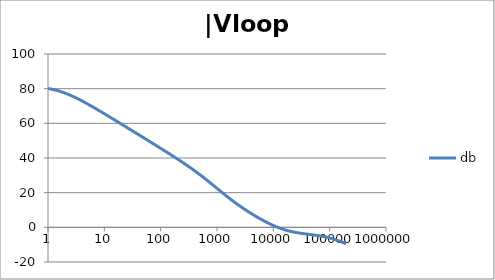
| Category | db |
|---|---|
| 1.0 | 80.109 |
| 1.0634378492473788 | 79.953 |
| 1.1309000592118907 | 79.783 |
| 1.2026419266820265 | 79.598 |
| 1.278934943925458 | 79.399 |
| 1.3600678260954062 | 79.183 |
| 1.4463476038134566 | 78.952 |
| 1.5381007850634825 | 78.705 |
| 1.6356745907936145 | 78.441 |
| 1.739438268902148 | 78.161 |
| 1.849784491579884 | 77.864 |
| 1.967130841296868 | 77.551 |
| 2.091921391056928 | 77.223 |
| 2.2246283849001642 | 76.879 |
| 2.365754025012901 | 76.521 |
| 2.5158323722080485 | 76.148 |
| 2.6754313669678584 | 75.762 |
| 2.8451549786972743 | 75.363 |
| 3.025645491321301 | 74.952 |
| 3.2175859338757533 | 74.529 |
| 3.42170266528945 | 74.096 |
| 3.6387681231394358 | 73.654 |
| 3.8696037467813236 | 73.202 |
| 4.115083085916729 | 72.742 |
| 4.376135106361553 | 72.275 |
| 4.653747705525078 | 71.801 |
| 4.948971450903514 | 71.32 |
| 5.262923555735513 | 70.834 |
| 5.596792106864742 | 70.343 |
| 5.951840560808945 | 69.847 |
| 6.329412525049976 | 69.347 |
| 6.730936842638569 | 68.843 |
| 7.157932999355504 | 68.336 |
| 7.612016873891456 | 67.826 |
| 8.094906852805886 | 67.313 |
| 8.608430333405762 | 66.798 |
| 9.154530639152917 | 66.281 |
| 9.735274373770007 | 65.761 |
| 10.352859241875105 | 65.24 |
| 11.009622365740512 | 64.718 |
| 11.708049129648925 | 64.194 |
| 12.4507825853165 | 63.669 |
| 13.240633453975693 | 63.143 |
| 14.080590762968805 | 62.616 |
| 14.973833157104059 | 62.088 |
| 15.923740927579823 | 61.559 |
| 16.93390880399795 | 61.03 |
| 18.008159557874837 | 60.5 |
| 19.150558469130036 | 59.969 |
| 20.365428710297824 | 59.438 |
| 21.65736770667993 | 58.906 |
| 23.031264534351347 | 58.374 |
| 24.492318421858034 | 57.842 |
| 26.046058425622668 | 57.31 |
| 27.698364353515743 | 56.777 |
| 29.45548901577305 | 56.243 |
| 31.32408188746347 | 55.71 |
| 33.311214272052936 | 55.176 |
| 35.42440606129053 | 54.642 |
| 37.67165419268462 | 54.107 |
| 40.06146291225952 | 53.573 |
| 42.60287595711691 | 53.038 |
| 45.30551077958928 | 52.503 |
| 48.17959494250036 | 51.967 |
| 51.23600482326248 | 51.431 |
| 54.486306773278585 | 50.895 |
| 57.94280088840825 | 50.359 |
| 61.61856755613799 | 49.822 |
| 65.52751695560372 | 49.284 |
| 69.68444169778837 | 48.746 |
| 74.10507280510043 | 48.208 |
| 78.80613924217637 | 47.669 |
| 83.8054312231895 | 47.129 |
| 89.12186753523771 | 46.589 |
| 94.77556713258299 | 46.047 |
| 100.78792527267464 | 45.505 |
| 107.18169448207877 | 44.962 |
| 113.98107065871142 | 44.417 |
| 121.21178463621371 | 43.871 |
| 128.90119955697148 | 43.324 |
| 137.07841442227294 | 42.775 |
| 145.77437421146283 | 42.224 |
| 155.02198698682062 | 41.671 |
| 164.85624842731968 | 41.116 |
| 175.3143742625403 | 40.558 |
| 186.43594110790573 | 39.998 |
| 198.26303623420247 | 39.434 |
| 210.84041683815525 | 38.867 |
| 224.21567941678887 | 38.296 |
| 238.43943988652958 | 37.721 |
| 253.56552512868072 | 37.141 |
| 269.65117668612646 | 36.557 |
| 286.75726738211927 | 35.967 |
| 304.9485316808965 | 35.371 |
| 324.2938106618788 | 34.769 |
| 344.8663125345048 | 34.16 |
| 366.7438896795682 | 33.544 |
| 390.00933326545766 | 32.921 |
| 414.7506865542229 | 32.29 |
| 441.06157808309626 | 31.651 |
| 469.0415759823428 | 31.004 |
| 498.7965647702637 | 30.349 |
| 530.4391460512702 | 29.685 |
| 564.089064633379 | 29.014 |
| 599.8736616776864 | 28.335 |
| 637.9283565946681 | 27.648 |
| 678.3971595109495 | 26.955 |
| 721.4332162458546 | 26.256 |
| 767.1993878601115 | 25.552 |
| 815.868866969862 | 24.844 |
| 867.6258331583267 | 24.132 |
| 922.6661499653554 | 23.419 |
| 981.1981060925172 | 22.705 |
| 1043.443203628628 | 21.991 |
| 1109.6369962786232 | 21.279 |
| 1180.0299807678607 | 20.57 |
| 1254.8885447951977 | 19.866 |
| 1334.4959751221782 | 19.166 |
| 1419.1535296132129 | 18.473 |
| 1509.1815772837017 | 17.787 |
| 1604.9208106703452 | 17.108 |
| 1706.7335351116335 | 16.438 |
| 1815.0050398174897 | 15.776 |
| 1930.1450559166665 | 15.124 |
| 2052.58930699948 | 14.48 |
| 2182.801158023697 | 13.846 |
| 2321.2733688234066 | 13.222 |
| 2468.5299588567814 | 12.607 |
| 2625.128190249376 | 12.001 |
| 2791.6606766374607 | 11.404 |
| 2968.757625791824 | 10.816 |
| 3157.08922450881 | 10.236 |
| 3357.3681747937244 | 9.666 |
| 3570.352390934236 | 9.103 |
| 3796.8478676703417 | 8.55 |
| 4037.7117303148448 | 8.004 |
| 4293.8554783669315 | 7.467 |
| 4566.248434893605 | 6.938 |
| 4855.9214147324665 | 6.418 |
| 5163.970625397384 | 5.906 |
| 5491.561815449236 | 5.403 |
| 5839.934686030357 | 4.91 |
| 6210.40758225729 | 4.426 |
| 6604.382482225307 | 3.952 |
| 7023.350302504747 | 3.488 |
| 7468.896540206577 | 3.036 |
| 7942.707272968458 | 2.595 |
| 8446.575539567106 | 2.167 |
| 8982.408125302747 | 1.751 |
| 9552.232777834151 | 1.348 |
| 10158.205880770249 | 0.96 |
| 10802.620614058389 | 0.586 |
| 11487.915632049675 | 0.227 |
| 12216.684292082227 | -0.116 |
| 12991.684468506162 | -0.443 |
| 13815.848989288772 | -0.755 |
| 14692.296734695852 | -1.05 |
| 15624.344440049217 | -1.328 |
| 16615.519247226184 | -1.59 |
| 17669.572052398642 | -1.837 |
| 18790.49170052441 | -2.067 |
| 19982.5200803064 | -2.282 |
| 21250.168176743602 | -2.483 |
| 22598.233142021272 | -2.67 |
| 24031.816449341983 | -2.844 |
| 25556.34319839602 | -3.006 |
| 27177.582645530147 | -3.157 |
| 28901.67003630542 | -3.298 |
| 30735.129823066054 | -3.43 |
| 32684.900355380338 | -3.555 |
| 34758.3601367905 | -3.673 |
| 36963.35574723439 | -3.787 |
| 39308.23153680468 | -3.897 |
| 41801.861203217486 | -4.005 |
| 44453.68137248706 | -4.112 |
| 47273.727309885995 | -4.22 |
| 50272.670896332245 | -4.331 |
| 53461.86101391677 | -4.445 |
| 56853.36649340195 | -4.564 |
| 60460.02178621637 | -4.689 |
| 64295.47553378361 | -4.823 |
| 68374.24221798431 | -4.965 |
| 72711.75708821259 | -5.118 |
| 77324.43457288652 | -5.283 |
| 82229.73039646025 | -5.46 |
| 87446.2076370035 | -5.65 |
| 92993.60697433475 | -5.855 |
| 98892.92139454243 | -6.075 |
| 105166.47563360249 | -6.31 |
| 111838.01066072512 | -6.561 |
| 118932.77352114675 | -6.828 |
| 126477.61287835392 | -7.111 |
| 134501.0806172993 | -7.41 |
| 143033.53989310883 | -7.725 |
| 152107.28003416685 | -8.055 |
| 161756.63873440344 | -8.4 |
| 172018.1319971993 | -8.759 |
| 182930.592322653 | -9.131 |
| 194535.31566115122 | -9.517 |